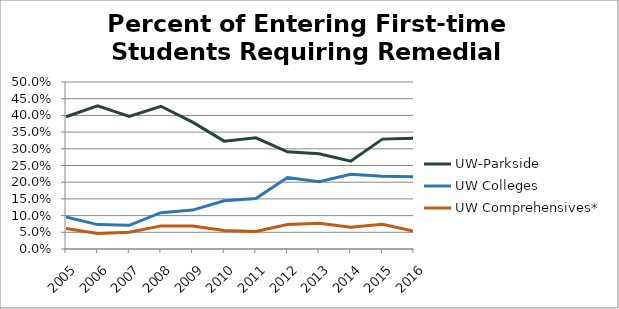
| Category | UW-Parkside | UW Colleges | UW Comprehensives* |
|---|---|---|---|
| 2005.0 | 0.396 | 0.096 | 0.061 |
| 2006.0 | 0.429 | 0.073 | 0.047 |
| 2007.0 | 0.397 | 0.071 | 0.05 |
| 2008.0 | 0.427 | 0.109 | 0.069 |
| 2009.0 | 0.38 | 0.117 | 0.069 |
| 2010.0 | 0.323 | 0.145 | 0.055 |
| 2011.0 | 0.333 | 0.151 | 0.052 |
| 2012.0 | 0.291 | 0.214 | 0.073 |
| 2013.0 | 0.285 | 0.202 | 0.077 |
| 2014.0 | 0.263 | 0.224 | 0.065 |
| 2015.0 | 0.329 | 0.218 | 0.074 |
| 2016.0 | 0.332 | 0.216 | 0.053 |